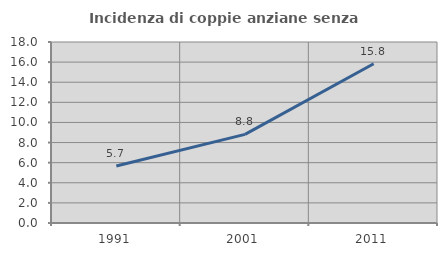
| Category | Incidenza di coppie anziane senza figli  |
|---|---|
| 1991.0 | 5.671 |
| 2001.0 | 8.815 |
| 2011.0 | 15.838 |